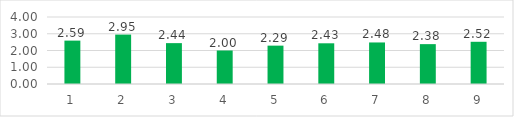
| Category | Series 0 |
|---|---|
| 0 | 2.59 |
| 1 | 2.95 |
| 2 | 2.44 |
| 3 | 2 |
| 4 | 2.29 |
| 5 | 2.43 |
| 6 | 2.48 |
| 7 | 2.38 |
| 8 | 2.52 |